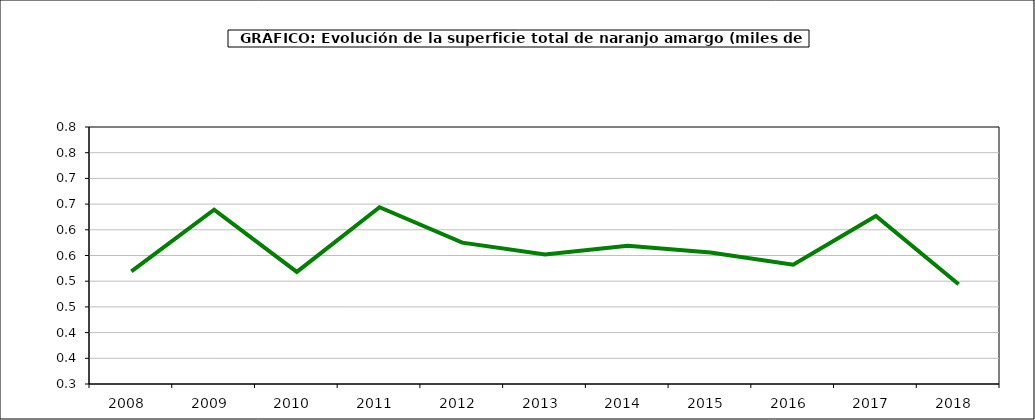
| Category | superficie |
|---|---|
| 2008.0 | 0.519 |
| 2009.0 | 0.639 |
| 2010.0 | 0.518 |
| 2011.0 | 0.644 |
| 2012.0 | 0.575 |
| 2013.0 | 0.552 |
| 2014.0 | 0.569 |
| 2015.0 | 0.556 |
| 2016.0 | 0.532 |
| 2017.0 | 0.627 |
| 2018.0 | 0.494 |